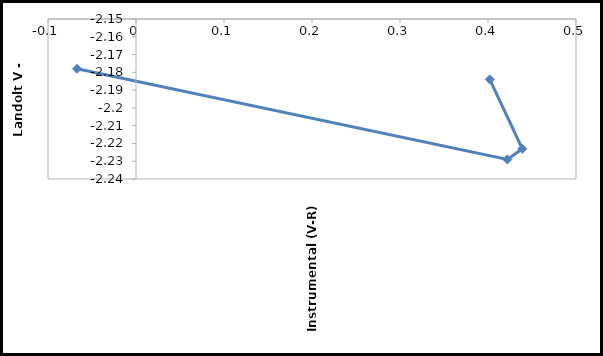
| Category | Series 0 |
|---|---|
| -0.0670000000000002 | -2.178 |
| 0.422000000000001 | -2.229 |
| 0.439 | -2.223 |
| 0.401999999999998 | -2.184 |